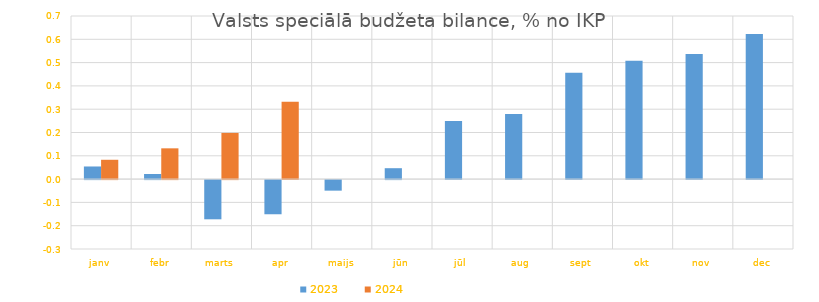
| Category | 2023 | 2024 |
|---|---|---|
| janv | 0.054 | 0.083 |
| febr | 0.022 | 0.132 |
| marts | -0.168 | 0.198 |
| apr | -0.147 | 0.332 |
| maijs | -0.045 | 0 |
| jūn | 0.047 | 0 |
| jūl | 0.249 | 0 |
| aug | 0.28 | 0 |
| sept | 0.456 | 0 |
| okt | 0.508 | 0 |
| nov | 0.536 | 0 |
| dec | 0.623 | 0 |